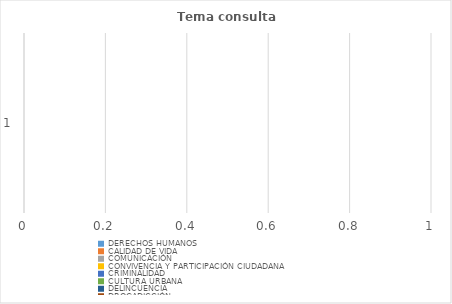
| Category | DERECHOS HUMANOS | CALIDAD DE VIDA | COMUNICACIÓN | CONVIVENCIA Y PARTICIPACIÓN CIUDADANA | CRIMINALIDAD | CULTURA URBANA | DELINCUENCIA | DROGADICCIÓN | MARCOS JURÍDICOS | POBLACIÓN | POLÍTICA PÚBLICA Y SOCIAL | SEGURIDAD | VIOLENCIA |
|---|---|---|---|---|---|---|---|---|---|---|---|---|---|
| 0 | 0 | 0 | 0 | 0 | 0 | 0 | 0 | 0 | 0 | 0 | 0 | 0 | 0 |